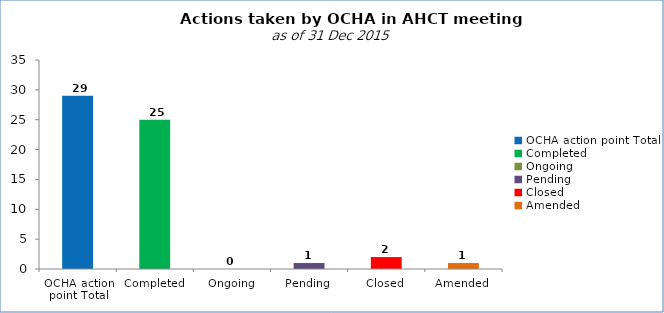
| Category | OCHA |
|---|---|
| OCHA action point Total | 29 |
| Completed | 25 |
| Ongoing | 0 |
| Pending | 1 |
| Closed | 2 |
| Amended | 1 |